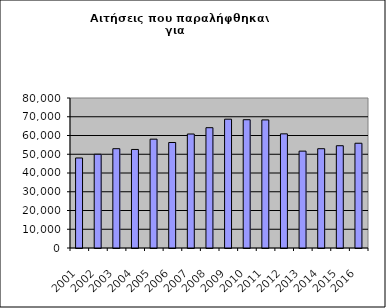
| Category | Series 1 |
|---|---|
| 2001.0 | 48010 |
| 2002.0 | 49998 |
| 2003.0 | 52964 |
| 2004.0 | 52551 |
| 2005.0 | 58046 |
| 2006.0 | 56263 |
| 2007.0 | 60792 |
| 2008.0 | 64163 |
| 2009.0 | 68694 |
| 2010.0 | 68418 |
| 2011.0 | 68310 |
| 2012.0 | 60877 |
| 2013.0 | 51662 |
| 2014.0 | 52955 |
| 2015.0 | 54542 |
| 2016.0 | 55868 |